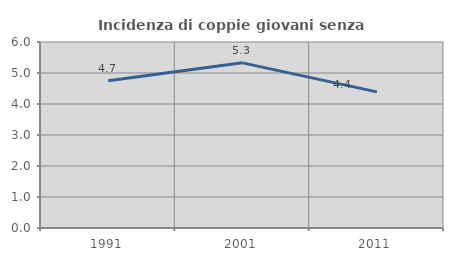
| Category | Incidenza di coppie giovani senza figli |
|---|---|
| 1991.0 | 4.748 |
| 2001.0 | 5.327 |
| 2011.0 | 4.39 |